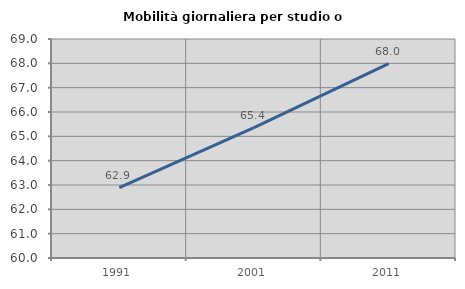
| Category | Mobilità giornaliera per studio o lavoro |
|---|---|
| 1991.0 | 62.897 |
| 2001.0 | 65.362 |
| 2011.0 | 67.99 |